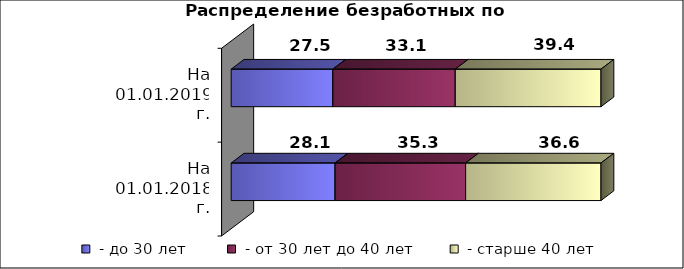
| Category |  - до 30 лет  |  - от 30 лет до 40 лет  |  - старше 40 лет  |
|---|---|---|---|
| На 01.01.2018 г. | 28.1 | 35.3 | 36.6 |
| На 01.01.2019 г. | 27.5 | 33.1 | 39.4 |